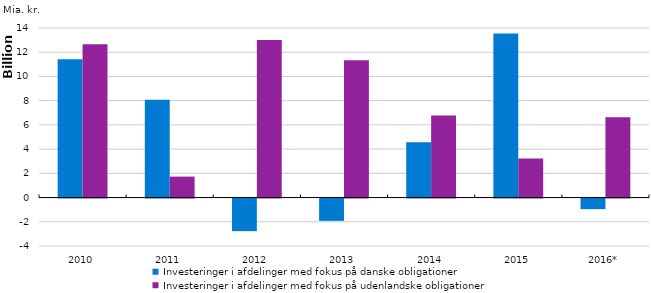
| Category | Investeringer i afdelinger med fokus på danske obligationer | Investeringer i afdelinger med fokus på udenlandske obligationer |
|---|---|---|
| 2010 | 11426664899 | 12654929632 |
| 2011 | 8077442134 | 1729830026 |
| 2012 | -2690686435 | 13000909996 |
| 2013 | -1839056441 | 11345111490 |
| 2014 | 4560811855 | 6781313344 |
| 2015 | 13542108807 | 3220165425 |
| 2016* | -873967703 | 6626318849 |